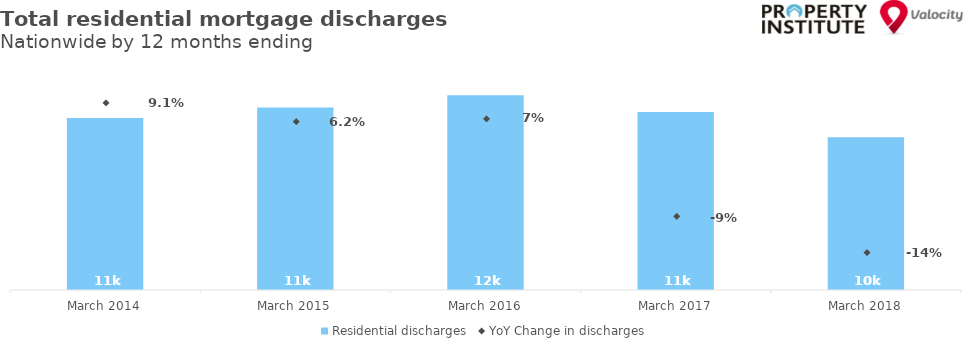
| Category | Residential discharges |
|---|---|
| 2014-03-01 | 10697 |
| 2015-03-01 | 11359 |
| 2016-03-01 | 12113 |
| 2017-03-01 | 11078 |
| 2018-03-01 | 9506 |